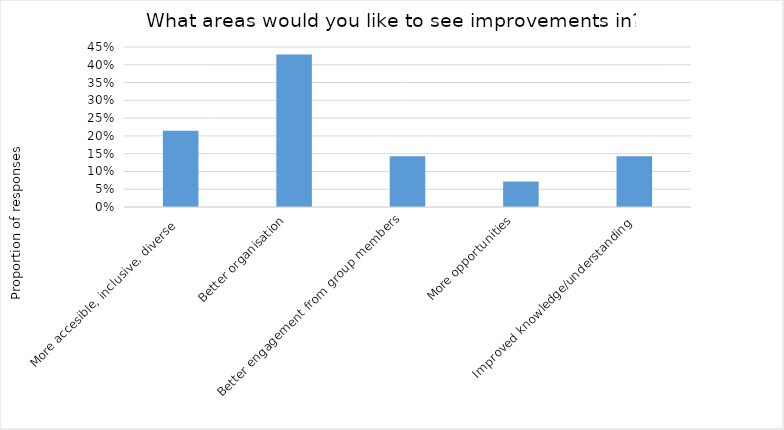
| Category | Proportion |
|---|---|
| More accesible, inclusive, diverse

 | 0.214 |
| Better organisation
 | 0.429 |
| Better engagement from group members
 | 0.143 |
| More opportunities
 | 0.071 |
| Improved knowledge/understanding | 0.143 |